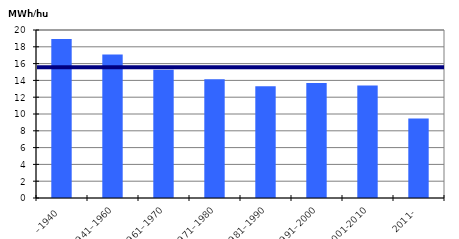
| Category | MWH/hus |
|---|---|
| –1940 | 18.933 |
| 1941–1960 | 17.085 |
| 1961–1970 | 15.264 |
| 1971–1980 | 14.146 |
| 1981–1990 | 13.301 |
| 1991–2000 | 13.689 |
| 2001-2010 | 13.386 |
| 2011- | 9.474 |